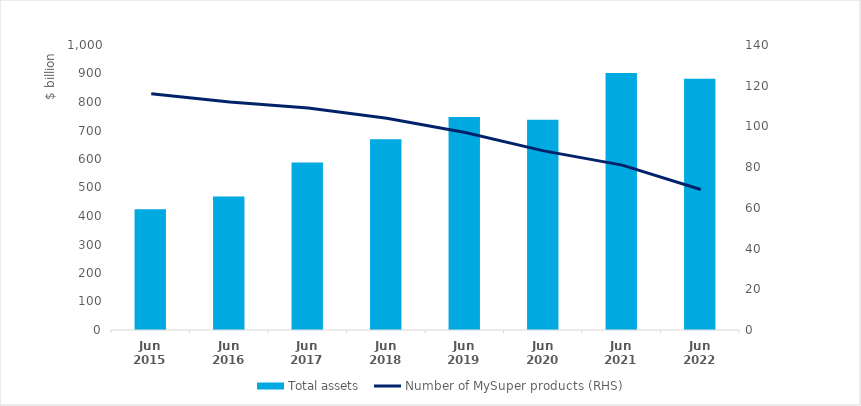
| Category | Total assets  |
|---|---|
| Jun 2015 | 423.3 |
| Jun 2016 | 468.4 |
| Jun 2017 | 587.3 |
| Jun 2018 | 669.5 |
| Jun 2019 | 747.2 |
| Jun 2020 | 737.3 |
| Jun 2021 | 901.6 |
| Jun 2022 | 881.3 |